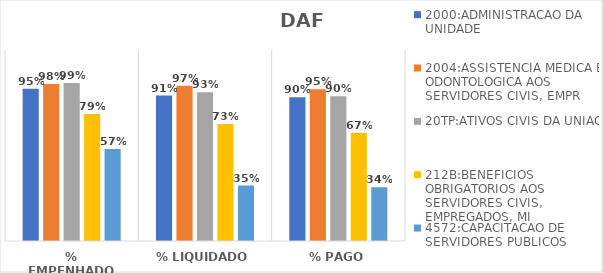
| Category | 2000:ADMINISTRACAO DA UNIDADE | 2004:ASSISTENCIA MEDICA E ODONTOLOGICA AOS SERVIDORES CIVIS, EMPR | 20TP:ATIVOS CIVIS DA UNIAO | 212B:BENEFICIOS OBRIGATORIOS AOS SERVIDORES CIVIS, EMPREGADOS, MI | 4572:CAPACITACAO DE SERVIDORES PUBLICOS FEDERAIS EM PROCESSO DE Q |
|---|---|---|---|---|---|
| % EMPENHADO | 0.952 | 0.982 | 0.988 | 0.793 | 0.574 |
| % LIQUIDADO | 0.909 | 0.97 | 0.929 | 0.732 | 0.346 |
| % PAGO | 0.899 | 0.948 | 0.905 | 0.675 | 0.336 |